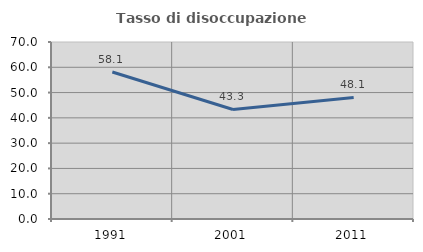
| Category | Tasso di disoccupazione giovanile  |
|---|---|
| 1991.0 | 58.129 |
| 2001.0 | 43.307 |
| 2011.0 | 48.095 |